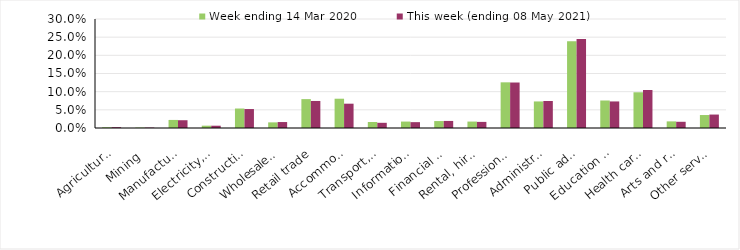
| Category | Week ending 14 Mar 2020 | This week (ending 08 May 2021) |
|---|---|---|
| Agriculture, forestry and fishing | 0.002 | 0.002 |
| Mining | 0.001 | 0.001 |
| Manufacturing | 0.022 | 0.021 |
| Electricity, gas, water and waste services | 0.006 | 0.006 |
| Construction | 0.054 | 0.052 |
| Wholesale trade | 0.016 | 0.016 |
| Retail trade | 0.08 | 0.074 |
| Accommodation and food services | 0.081 | 0.067 |
| Transport, postal and warehousing | 0.017 | 0.014 |
| Information media and telecommunications | 0.018 | 0.016 |
| Financial and insurance services | 0.019 | 0.019 |
| Rental, hiring and real estate services | 0.018 | 0.017 |
| Professional, scientific and technical services | 0.126 | 0.125 |
| Administrative and support services | 0.073 | 0.074 |
| Public administration and safety | 0.239 | 0.245 |
| Education and training | 0.076 | 0.073 |
| Health care and social assistance | 0.098 | 0.105 |
| Arts and recreation services | 0.018 | 0.017 |
| Other services | 0.036 | 0.037 |